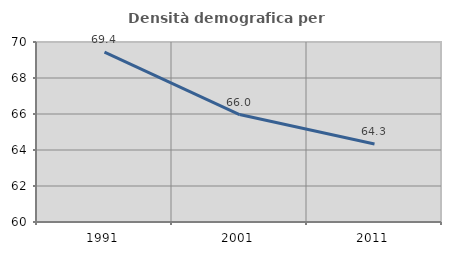
| Category | Densità demografica |
|---|---|
| 1991.0 | 69.434 |
| 2001.0 | 65.969 |
| 2011.0 | 64.331 |